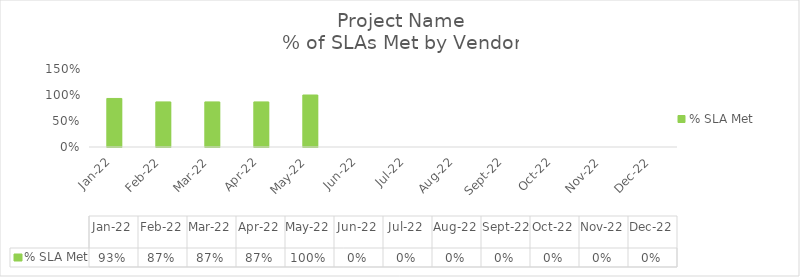
| Category | % SLA Met |
|---|---|
| 2022-01-01 | 0.933 |
| 2022-02-01 | 0.867 |
| 2022-03-01 | 0.867 |
| 2022-04-01 | 0.867 |
| 2022-05-01 | 1 |
| 2022-06-01 | 0 |
| 2022-07-01 | 0 |
| 2022-08-01 | 0 |
| 2022-09-01 | 0 |
| 2022-10-01 | 0 |
| 2022-11-01 | 0 |
| 2022-12-01 | 0 |